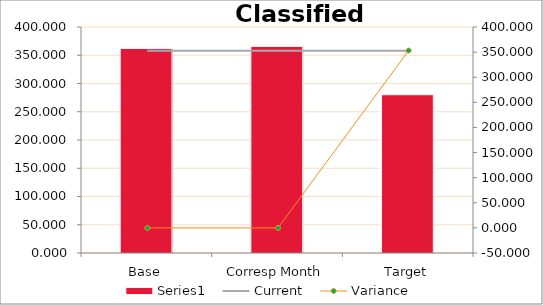
| Category | Series 0 |
|---|---|
| Base | 361.963 |
| Corresp Month | 365.632 |
| Target | 280.122 |